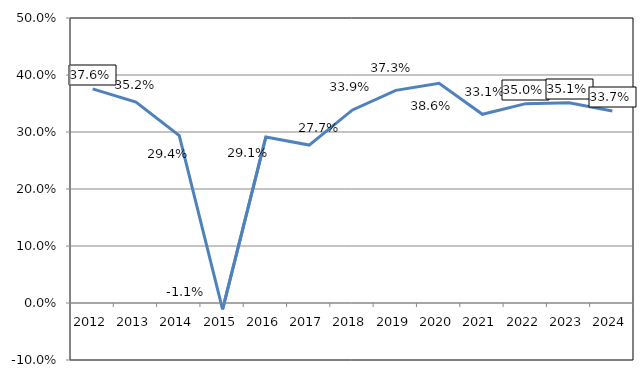
| Category | Series 0 | Series 1 |
|---|---|---|
| 2012.0 | 0.376 |  |
| 2013.0 | 0.352 |  |
| 2014.0 | 0.294 |  |
| 2015.0 | -0.011 |  |
| 2016.0 | 0.291 |  |
| 2017.0 | 0.277 |  |
| 2018.0 | 0.339 |  |
| 2019.0 | 0.373 |  |
| 2020.0 | 0.386 |  |
| 2021.0 | 0.331 |  |
| 2022.0 | 0.35 |  |
| 2023.0 | 0.351 |  |
| 2024.0 | 0.337 |  |